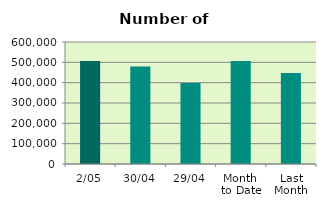
| Category | Series 0 |
|---|---|
| 2/05 | 506528 |
| 30/04 | 479450 |
| 29/04 | 398860 |
| Month 
to Date | 506528 |
| Last
Month | 447135.9 |